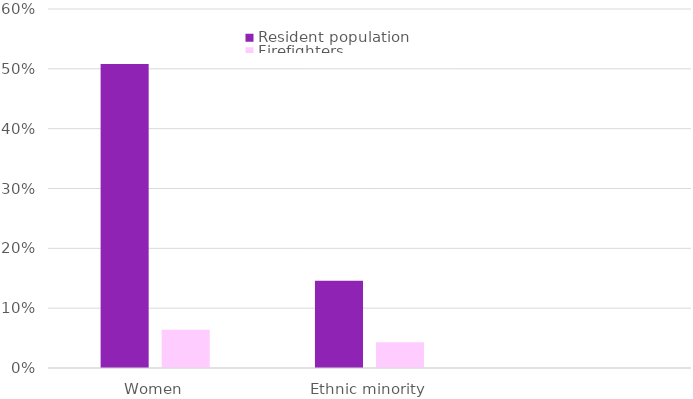
| Category | Resident population | Firefighters |
|---|---|---|
| Women | 0.508 | 0.064 |
| Ethnic minority | 0.146 | 0.043 |